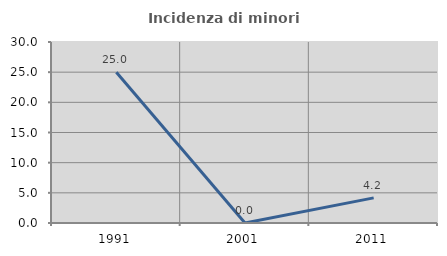
| Category | Incidenza di minori stranieri |
|---|---|
| 1991.0 | 25 |
| 2001.0 | 0 |
| 2011.0 | 4.167 |